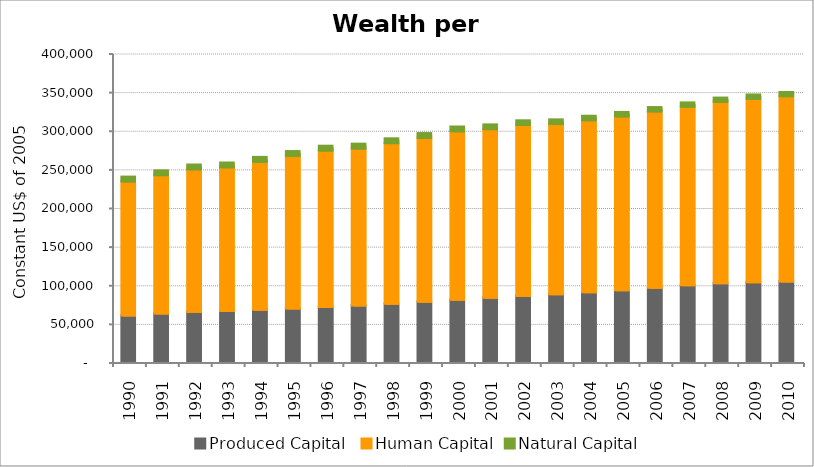
| Category | Produced Capital  | Human Capital | Natural Capital |
|---|---|---|---|
| 1990.0 | 60295.944 | 173447.213 | 5633.967 |
| 1991.0 | 62630.494 | 179195.558 | 5633.106 |
| 1992.0 | 64626.029 | 184764.452 | 5631.077 |
| 1993.0 | 66093.137 | 185920.251 | 5612.379 |
| 1994.0 | 67566.468 | 191675.8 | 5640.257 |
| 1995.0 | 69309.258 | 197521.301 | 5600.896 |
| 1996.0 | 71113.232 | 202575.578 | 5663.622 |
| 1997.0 | 73074.488 | 203264.965 | 5671.651 |
| 1998.0 | 75433.649 | 207827.412 | 5672.201 |
| 1999.0 | 78072.284 | 212012.998 | 5652.484 |
| 2000.0 | 80709.024 | 217886.215 | 5634.317 |
| 2001.0 | 83190.565 | 218208.639 | 5535.206 |
| 2002.0 | 85453.71 | 221357.65 | 5438.448 |
| 2003.0 | 87743.107 | 220391.004 | 5318.261 |
| 2004.0 | 90129.641 | 222813.787 | 5218.635 |
| 2005.0 | 92854.529 | 225045.819 | 5144.115 |
| 2006.0 | 95967.409 | 228388.756 | 5026.4 |
| 2007.0 | 99259.257 | 231220.291 | 4911.266 |
| 2008.0 | 101994.447 | 234793.288 | 4880.035 |
| 2009.0 | 103385.181 | 237429.808 | 4825.146 |
| 2010.0 | 104279.315 | 239819.217 | 4753.138 |